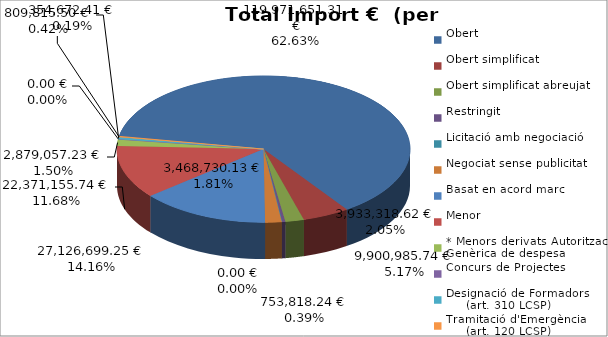
| Category | Total preu
(amb IVA) |
|---|---|
| Obert | 119971651.31 |
| Obert simplificat | 9900985.74 |
| Obert simplificat abreujat | 3933318.62 |
| Restringit | 753818.24 |
| Licitació amb negociació | 0 |
| Negociat sense publicitat | 3468730.13 |
| Basat en acord marc | 27126699.25 |
| Menor | 22371155.74 |
| * Menors derivats Autorització Genèrica de despesa | 2879057.23 |
| Concurs de Projectes | 0 |
| Designació de Formadors
     (art. 310 LCSP) | 809815.5 |
| Tramitació d'Emergència
     (art. 120 LCSP) | 354672.41 |